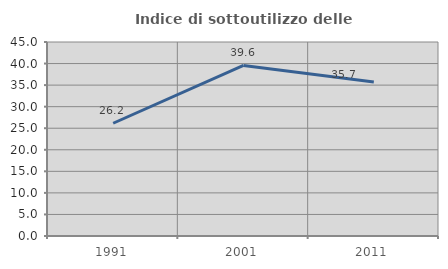
| Category | Indice di sottoutilizzo delle abitazioni  |
|---|---|
| 1991.0 | 26.154 |
| 2001.0 | 39.565 |
| 2011.0 | 35.738 |